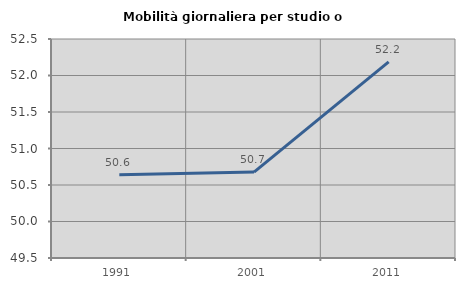
| Category | Mobilità giornaliera per studio o lavoro |
|---|---|
| 1991.0 | 50.64 |
| 2001.0 | 50.677 |
| 2011.0 | 52.187 |